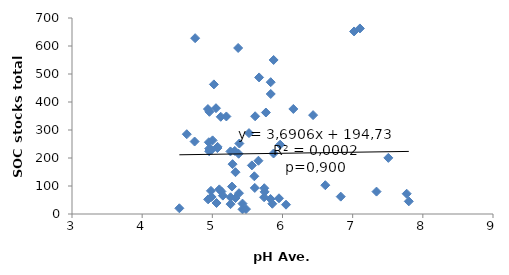
| Category | Series 0 |
|---|---|
| 6.61 | 102.815 |
| 7.103333333333334 | 662.671 |
| 5.5225 | 288.947 |
| 5.7633333333333345 | 362.455 |
| 4.95 | 256.288 |
| 5.385 | 251.709 |
| 5.021999999999999 | 462.897 |
| 5.38 | 74.214 |
| 5.051666666666667 | 377.819 |
| 5.832 | 470.715 |
| 7.34 | 79.973 |
| 5.965999999999999 | 247.699 |
| 6.83 | 62.035 |
| 7.02 | 651.921 |
| 5.43 | 37.113 |
| 5.605 | 93.084 |
| 7.8 | 45.168 |
| 5.744999999999999 | 79.079 |
| 6.05 | 33.313 |
| 5.368 | 592.914 |
| 4.955 | 224.095 |
| 5.13 | 80.297 |
| 4.99 | 60.733 |
| 5.657142857142857 | 190.189 |
| 5.48 | 17.528 |
| 5.74 | 92.069 |
| 5.563333333333333 | 173.554 |
| 5.95 | 56.097 |
| 5.33 | 149.285 |
| 5.8725000000000005 | 216.118 |
| 5.873333333333334 | 550.08 |
| 5.8325000000000005 | 428.618 |
| 5.06 | 39.318 |
| 5.26 | 59.683 |
| 5.279999999999999 | 97.969 |
| 4.958333333333333 | 364.905 |
| 5.2 | 348.337 |
| 5.83 | 53.682 |
| 4.937142857142858 | 374.794 |
| 4.636 | 284.982 |
| 4.53 | 20.421 |
| 5.26 | 35.267 |
| 4.98 | 82.651 |
| 5.004 | 262.961 |
| 5.072000000000001 | 235.38 |
| 5.288571428571428 | 178.005 |
| 4.94 | 52.242 |
| 5.32 | 225.178 |
| 5.1 | 87.964 |
| 5.33 | 56.941 |
| 4.755 | 627.933 |
| 5.075 | 239.658 |
| 5.7375 | 59.839 |
| 5.15 | 65.646 |
| 4.7475000000000005 | 258.838 |
| 5.598333333333334 | 134.735 |
| 5.120000000000001 | 347.236 |
| 5.61 | 349.039 |
| 5.258 | 223.453 |
| 7.508333333333333 | 200.402 |
| 7.77 | 72.403 |
| 5.855 | 36.592 |
| 5.43 | 16.724 |
| 6.154473684210526 | 375.112 |
| 5.6665909090909095 | 487.774 |
| 6.43625 | 353.125 |
| 4.955294117647059 | 233.469 |
| 4.988333333333333 | 229.423 |
| 5.375 | 215.148 |